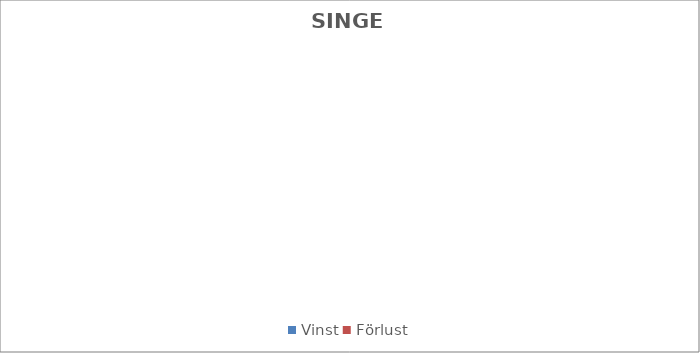
| Category | Series 0 |
|---|---|
| Vinst | 0 |
| Förlust | 0 |